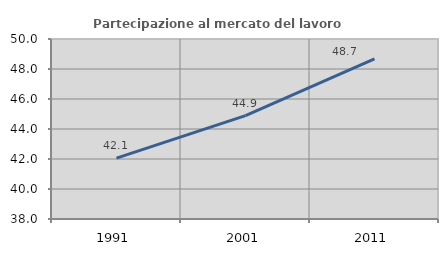
| Category | Partecipazione al mercato del lavoro  femminile |
|---|---|
| 1991.0 | 42.06 |
| 2001.0 | 44.889 |
| 2011.0 | 48.67 |